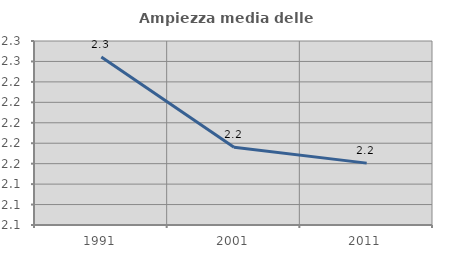
| Category | Ampiezza media delle famiglie |
|---|---|
| 1991.0 | 2.264 |
| 2001.0 | 2.176 |
| 2011.0 | 2.161 |